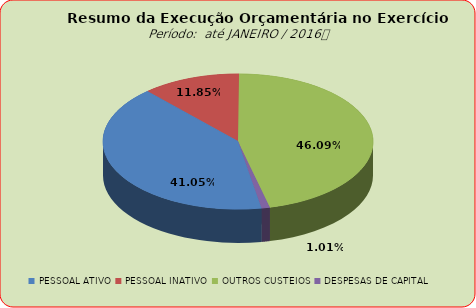
| Category | Series 0 |
|---|---|
| PESSOAL ATIVO | 14328405.04 |
| PESSOAL INATIVO | 4136515.45 |
| OUTROS CUSTEIOS | 16089744.06 |
| DESPESAS DE CAPITAL | 351448 |